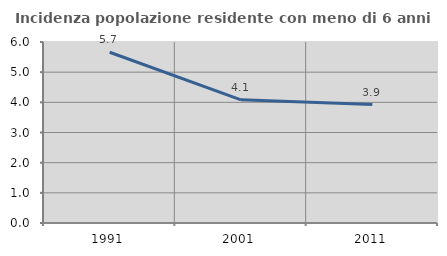
| Category | Incidenza popolazione residente con meno di 6 anni |
|---|---|
| 1991.0 | 5.66 |
| 2001.0 | 4.082 |
| 2011.0 | 3.926 |